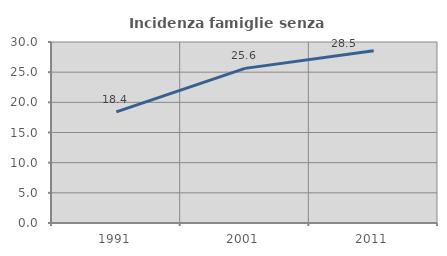
| Category | Incidenza famiglie senza nuclei |
|---|---|
| 1991.0 | 18.426 |
| 2001.0 | 25.631 |
| 2011.0 | 28.547 |